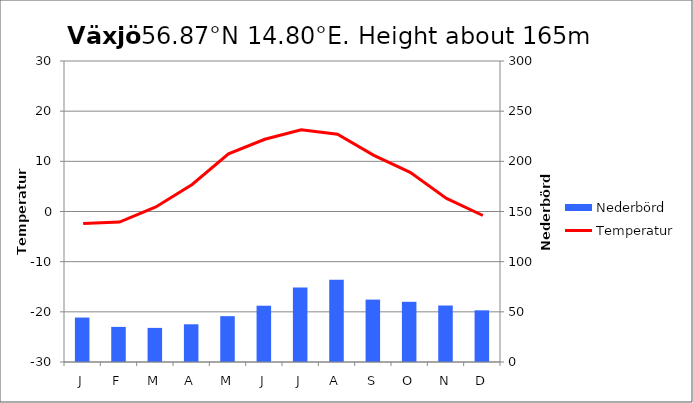
| Category | Nederbörd |
|---|---|
| J | 44.3 |
| F | 35 |
| M | 34 |
| A | 37.6 |
| M | 45.7 |
| J | 56.1 |
| J | 74.2 |
| A | 81.9 |
| S | 62.2 |
| O | 60 |
| N | 56.3 |
| D | 51.5 |